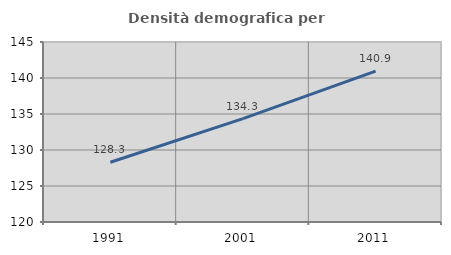
| Category | Densità demografica |
|---|---|
| 1991.0 | 128.294 |
| 2001.0 | 134.348 |
| 2011.0 | 140.949 |